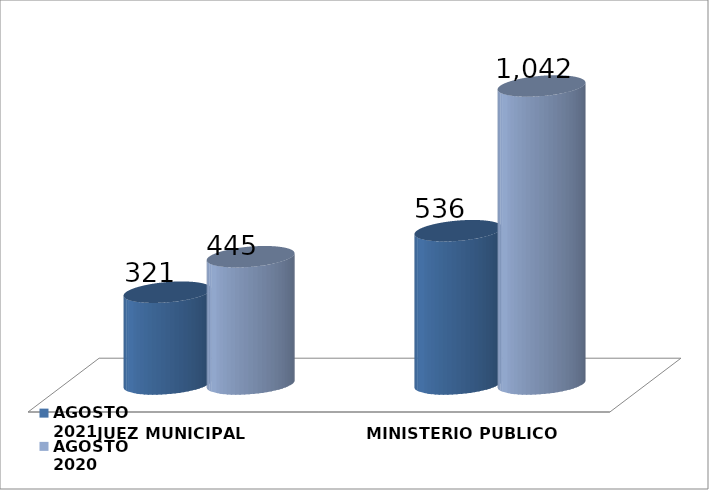
| Category | AGOSTO 2021 | AGOSTO 2020 |
|---|---|---|
| JUEZ MUNICIPAL | 321 | 445 |
| MINISTERIO PUBLICO | 536 | 1042 |